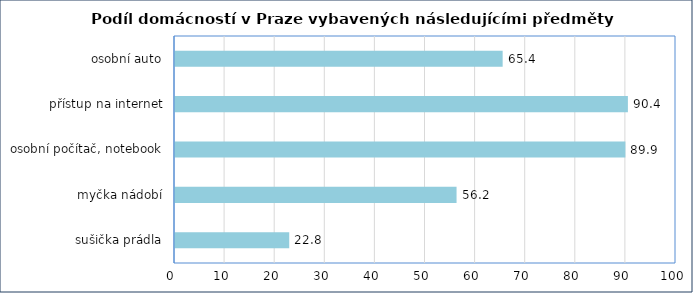
| Category | Series 0 |
|---|---|
| sušička prádla | 22.8 |
| myčka nádobí | 56.2 |
| osobní počítač, notebook | 89.9 |
| přístup na internet | 90.4 |
| osobní auto | 65.4 |